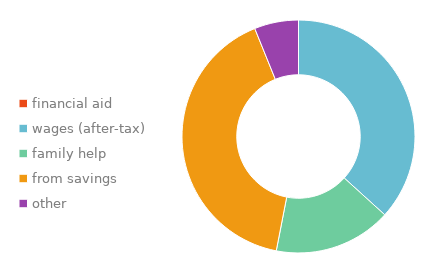
| Category | Series 0 |
|---|---|
| financial aid | 0 |
| wages (after-tax) | 0.367 |
| family help | 0.163 |
| from savings | 0.408 |
| other | 0.061 |